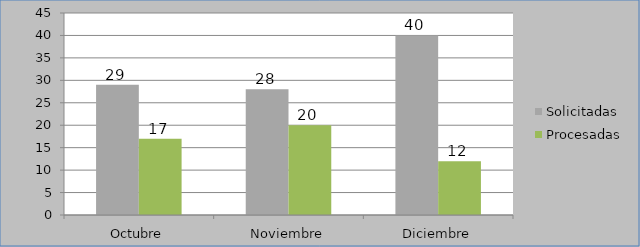
| Category | Solicitadas | Procesadas |
|---|---|---|
| Octubre | 29 | 17 |
| Noviembre | 28 | 20 |
| Diciembre | 40 | 12 |